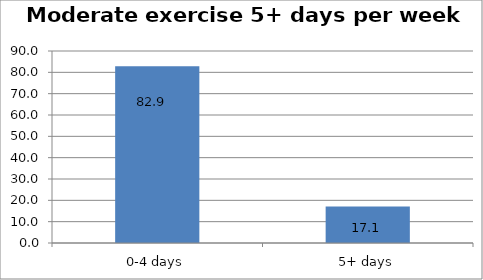
| Category | Series 0 |
|---|---|
| 0-4 days | 82.883 |
| 5+ days | 17.117 |